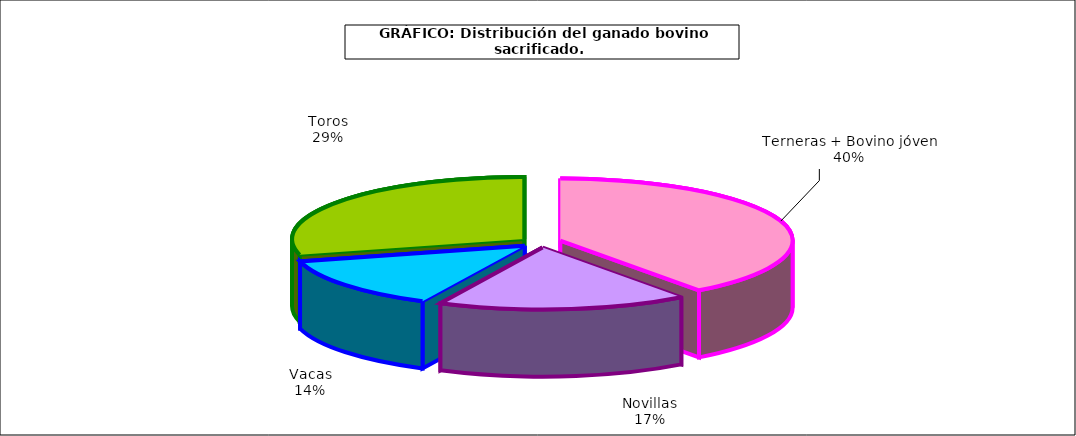
| Category | Series 0 |
|---|---|
| Terneras + Bovino jóven | 999724 |
| Novillas | 437599 |
| Vacas | 342647 |
| Toros | 730804 |